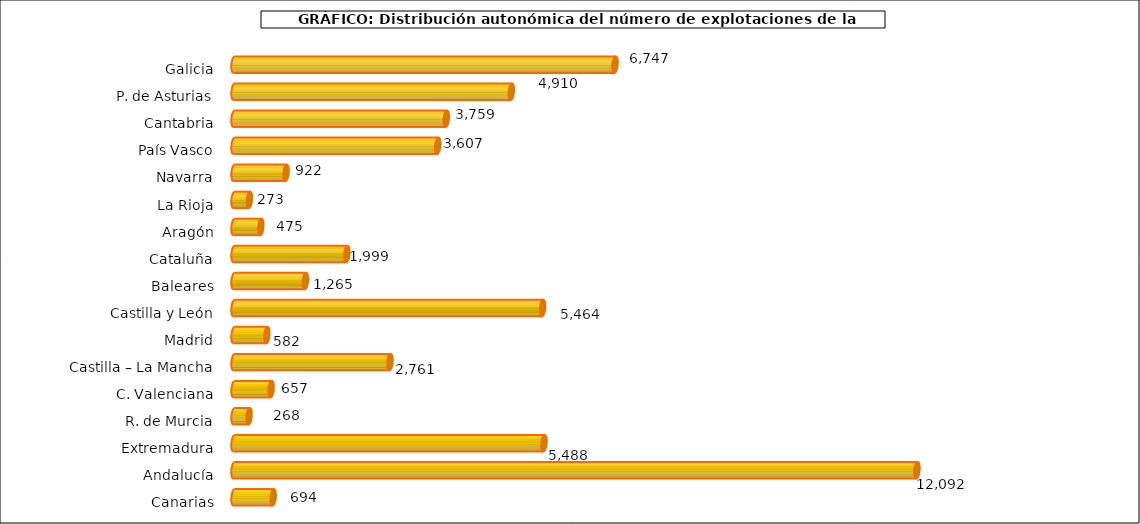
| Category | num. Explotaciones |
|---|---|
| 0 | 6747 |
| 1 | 4910 |
| 2 | 3759 |
| 3 | 3607 |
| 4 | 922 |
| 5 | 273 |
| 6 | 475 |
| 7 | 1999 |
| 8 | 1265 |
| 9 | 5464 |
| 10 | 582 |
| 11 | 2761 |
| 12 | 657 |
| 13 | 268 |
| 14 | 5488 |
| 15 | 12092 |
| 16 | 694 |